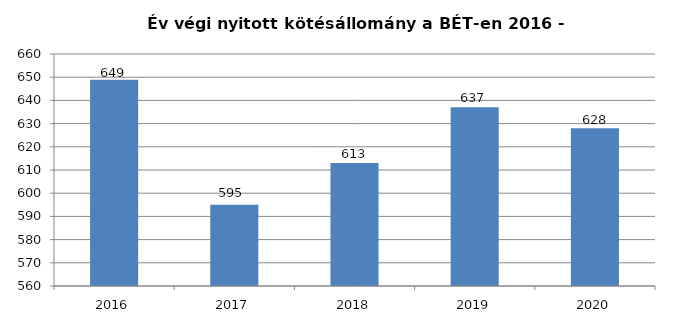
| Category | BÉT kontraktus (ezer db) |
|---|---|
| 2016.0 | 648.876 |
| 2017.0 | 595 |
| 2018.0 | 613 |
| 2019.0 | 637 |
| 2020.0 | 628 |